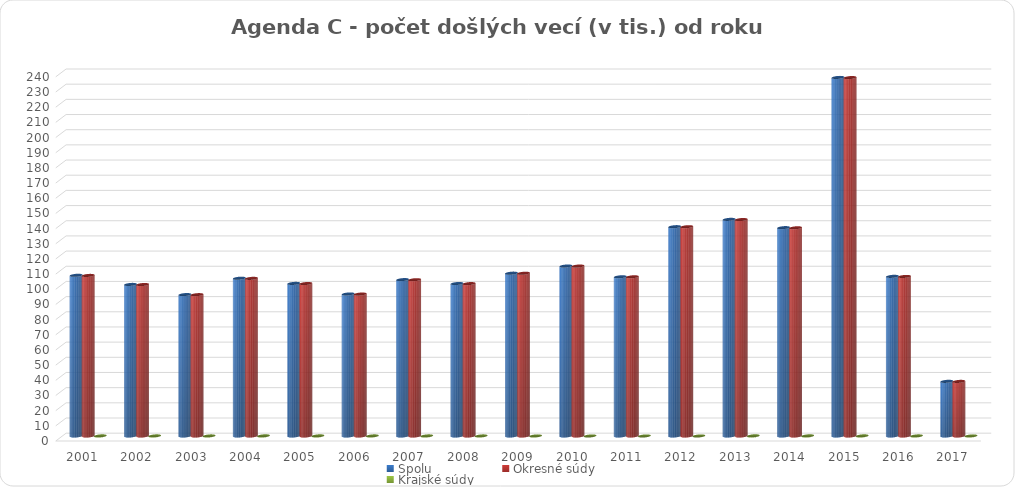
| Category | Spolu | Okresné súdy | Krajské súdy |
|---|---|---|---|
| 2001.0 | 105.9 | 105.82 | 0.08 |
| 2002.0 | 99.89 | 99.82 | 0.07 |
| 2003.0 | 93.2 | 93.15 | 0.05 |
| 2004.0 | 103.98 | 103.88 | 0.1 |
| 2005.0 | 100.56 | 100.47 | 0.09 |
| 2006.0 | 93.61 | 93.54 | 0.07 |
| 2007.0 | 103.06 | 103 | 0.06 |
| 2008.0 | 100.48 | 100.43 | 0.05 |
| 2009.0 | 107.3 | 107.26 | 0.04 |
| 2010.0 | 112.02 | 112 | 0.02 |
| 2011.0 | 104.93 | 104.91 | 0.02 |
| 2012.0 | 137.95 | 137.92 | 0.03 |
| 2013.0 | 142.76 | 142.64 | 0.12 |
| 2014.0 | 137.31 | 137.2 | 0.11 |
| 2015.0 | 236.3 | 236.21 | 0.09 |
| 2016.0 | 105.21 | 105.15 | 0.06 |
| 2017.0 | 36.02 | 35.98 | 0.04 |